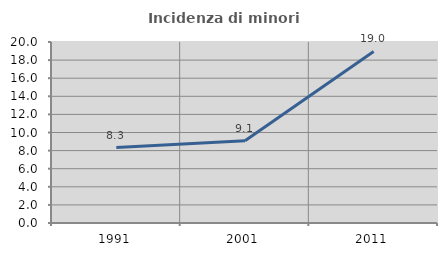
| Category | Incidenza di minori stranieri |
|---|---|
| 1991.0 | 8.333 |
| 2001.0 | 9.091 |
| 2011.0 | 18.957 |